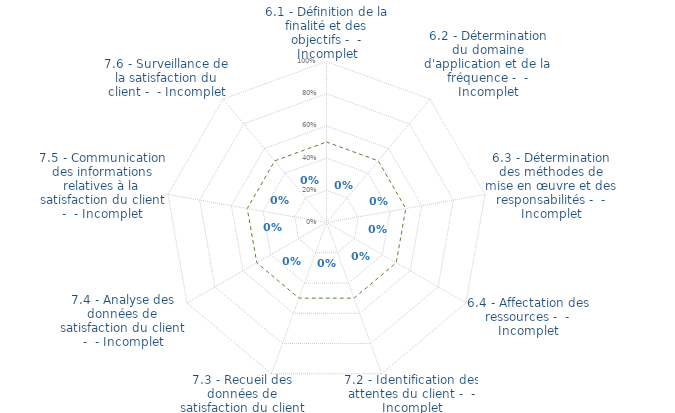
| Category | Traçage dans les GRAPHES | limite de CONFORMITÉ |
|---|---|---|
| 6.1 - Définition de la finalité et des objectifs -  - Incomplet | 0 | 0.5 |
| 6.2 - Détermination du domaine d'application et de la fréquence -  - Incomplet | 0 | 0.5 |
| 6.3 - Détermination des méthodes de mise en œuvre et des responsabilités -  - Incomplet | 0 | 0.5 |
| 6.4 - Affectation des ressources -  - Incomplet | 0 | 0.5 |
| 7.2 - Identification des attentes du client -  - Incomplet | 0 | 0.5 |
| 7.3 - Recueil des données de satisfaction du client -  - Incomplet | 0 | 0.5 |
| 7.4 - Analyse des données de satisfaction du client -  - Incomplet | 0 | 0.5 |
| 7.5 - Communication des informations relatives à la satisfaction du client -  - Incomplet | 0 | 0.5 |
| 7.6 - Surveillance de la satisfaction du client -  - Incomplet | 0 | 0.5 |